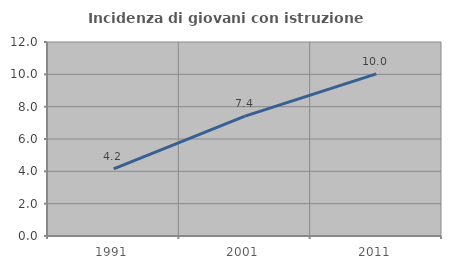
| Category | Incidenza di giovani con istruzione universitaria |
|---|---|
| 1991.0 | 4.151 |
| 2001.0 | 7.419 |
| 2011.0 | 10.026 |